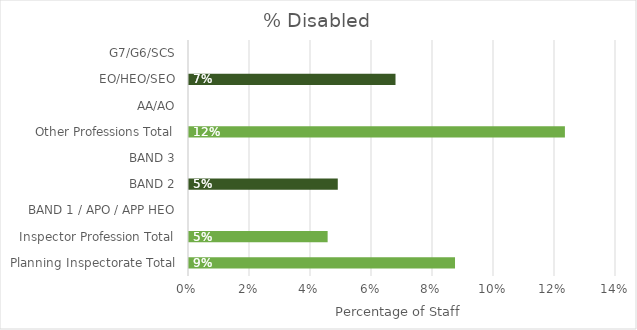
| Category | % Disabled |
|---|---|
| Planning Inspectorate Total | 0.087 |
| Inspector Profession Total | 0.045 |
| BAND 1 / APO / APP HEO | 0 |
| BAND 2 | 0.049 |
| BAND 3 | 0 |
| Other Professions Total | 0.123 |
| AA/AO | 0 |
| EO/HEO/SEO | 0.068 |
| G7/G6/SCS | 0 |